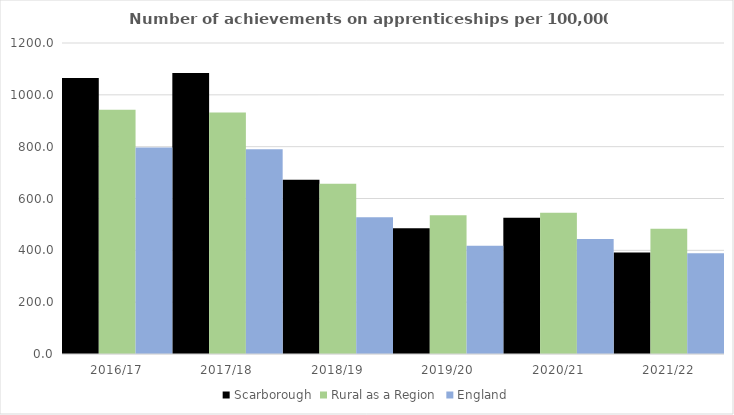
| Category | Scarborough | Rural as a Region | England |
|---|---|---|---|
| 2016/17 | 1065 | 942.594 | 797 |
| 2017/18 | 1084 | 931.709 | 790 |
| 2018/19 | 672 | 656.44 | 528 |
| 2019/20 | 485 | 535.552 | 418 |
| 2020/21 | 526 | 545.333 | 444 |
| 2021/22 | 392 | 482.936 | 389 |